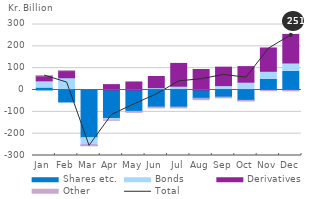
| Category | Shares etc. | Bonds | Derivatives | Other |
|---|---|---|---|---|
| 2020-01-01 | 9.182 | 32.837 | 23.109 | 0.969 |
| 2020-02-01 | -54.992 | 56.127 | 32.612 | 0.343 |
| 2020-03-01 | -218.072 | -34.736 | -0.985 | -1.845 |
| 2020-04-01 | -130.28 | -6.183 | 24.63 | -2.496 |
| 2020-05-01 | -97.893 | -0.904 | 36.834 | -3.644 |
| 2020-06-01 | -78.067 | 10.782 | 51.078 | -3.905 |
| 2020-07-01 | -78.257 | 17.343 | 104.439 | -3.778 |
| 2020-08-01 | -38.103 | -2.198 | 93.802 | -4.183 |
| 2020-09-01 | -32.583 | 20.126 | 84.579 | -3.198 |
| 2020-10-01 | -47.476 | 35.679 | 71.437 | -3.228 |
| 2020-11-01 | 48.024 | 37.709 | 106.719 | -3.278 |
| 2020-12-01 | 85.427 | 38.348 | 130.815 | -4.103 |